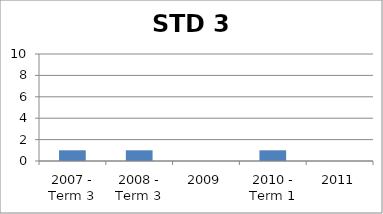
| Category | Rank |
|---|---|
| 2007 - Term 3 | 1 |
| 2008 - Term 3 | 1 |
| 2009 | 0 |
| 2010 - Term 1 | 1 |
| 2011 | 0 |